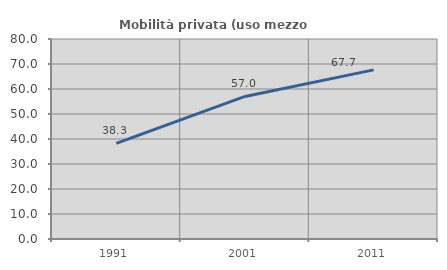
| Category | Mobilità privata (uso mezzo privato) |
|---|---|
| 1991.0 | 38.262 |
| 2001.0 | 57.023 |
| 2011.0 | 67.65 |